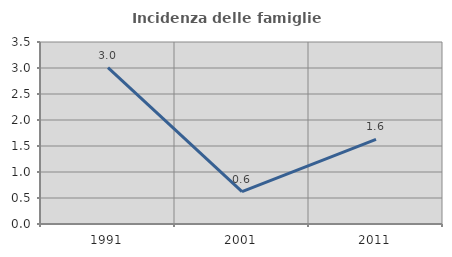
| Category | Incidenza delle famiglie numerose |
|---|---|
| 1991.0 | 3.005 |
| 2001.0 | 0.621 |
| 2011.0 | 1.627 |